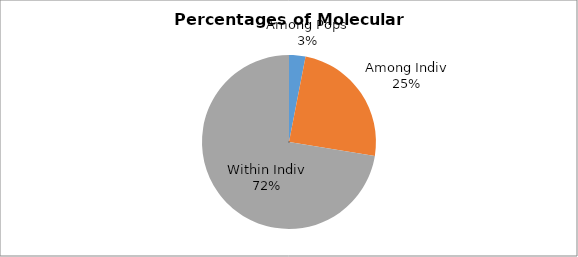
| Category | Est. Var. |
|---|---|
| Among Pops | 0.129 |
| Among Indiv | 1.032 |
| Within Indiv | 3.047 |